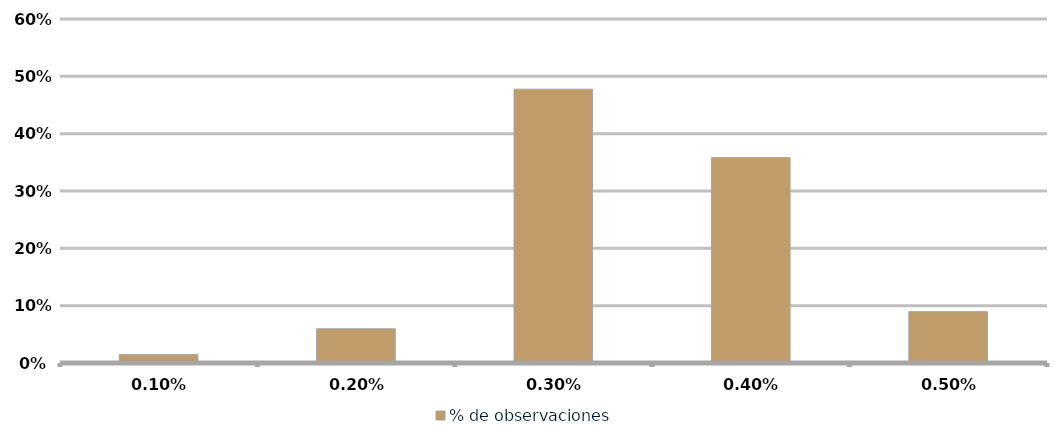
| Category | % de observaciones  |
|---|---|
| 0.001 | 0.015 |
| 0.002 | 0.06 |
| 0.003 | 0.478 |
| 0.004 | 0.358 |
| 0.005 | 0.09 |